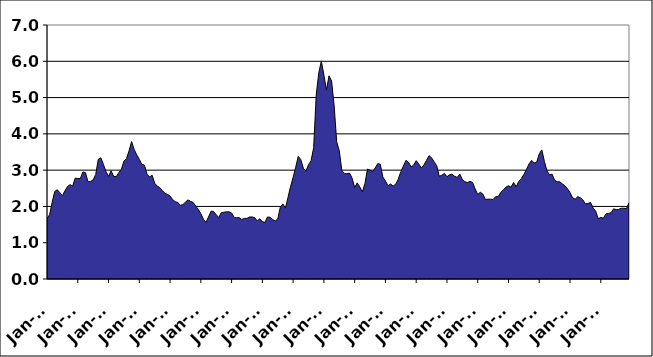
| Category | Series 0 |
|---|---|
| 2000-01-01 | 1.67 |
| 2000-02-01 | 1.77 |
| 2000-03-01 | 2.11 |
| 2000-04-01 | 2.41 |
| 2000-05-01 | 2.46 |
| 2000-06-01 | 2.38 |
| 2000-07-01 | 2.3 |
| 2000-08-01 | 2.43 |
| 2000-09-01 | 2.55 |
| 2000-10-01 | 2.6 |
| 2000-11-01 | 2.56 |
| 2000-12-01 | 2.78 |
| 2001-01-01 | 2.77 |
| 2001-02-01 | 2.77 |
| 2001-03-01 | 2.95 |
| 2001-04-01 | 2.93 |
| 2001-05-01 | 2.68 |
| 2001-06-01 | 2.69 |
| 2001-07-01 | 2.73 |
| 2001-08-01 | 2.88 |
| 2001-09-01 | 3.3 |
| 2001-10-01 | 3.34 |
| 2001-11-01 | 3.16 |
| 2001-12-01 | 2.96 |
| 2002-01-01 | 2.83 |
| 2002-02-01 | 2.98 |
| 2002-03-01 | 2.83 |
| 2002-04-01 | 2.82 |
| 2002-05-01 | 2.93 |
| 2002-06-01 | 3.02 |
| 2002-07-01 | 3.25 |
| 2002-08-01 | 3.32 |
| 2002-09-01 | 3.53 |
| 2002-10-01 | 3.79 |
| 2002-11-01 | 3.57 |
| 2002-12-01 | 3.42 |
| 2003-01-01 | 3.3 |
| 2003-02-01 | 3.16 |
| 2003-03-01 | 3.14 |
| 2003-04-01 | 2.89 |
| 2003-05-01 | 2.81 |
| 2003-06-01 | 2.86 |
| 2003-07-01 | 2.64 |
| 2003-08-01 | 2.56 |
| 2003-09-01 | 2.52 |
| 2003-10-01 | 2.44 |
| 2003-11-01 | 2.36 |
| 2003-12-01 | 2.33 |
| 2004-01-01 | 2.29 |
| 2004-02-01 | 2.19 |
| 2004-03-01 | 2.13 |
| 2004-04-01 | 2.11 |
| 2004-05-01 | 2.03 |
| 2004-06-01 | 2.05 |
| 2004-07-01 | 2.12 |
| 2004-08-01 | 2.18 |
| 2004-09-01 | 2.14 |
| 2004-10-01 | 2.11 |
| 2004-11-01 | 2.01 |
| 2004-12-01 | 1.92 |
| 2005-01-01 | 1.8 |
| 2005-02-01 | 1.65 |
| 2005-03-01 | 1.56 |
| 2005-04-01 | 1.71 |
| 2005-05-01 | 1.87 |
| 2005-06-01 | 1.86 |
| 2005-07-01 | 1.77 |
| 2005-08-01 | 1.7 |
| 2005-09-01 | 1.83 |
| 2005-10-01 | 1.84 |
| 2005-11-01 | 1.85 |
| 2005-12-01 | 1.85 |
| 2006-01-01 | 1.82 |
| 2006-02-01 | 1.7 |
| 2006-03-01 | 1.69 |
| 2006-04-01 | 1.69 |
| 2006-05-01 | 1.64 |
| 2006-06-01 | 1.67 |
| 2006-07-01 | 1.67 |
| 2006-08-01 | 1.71 |
| 2006-09-01 | 1.71 |
| 2006-10-01 | 1.69 |
| 2006-11-01 | 1.6 |
| 2006-12-01 | 1.66 |
| 2007-01-01 | 1.58 |
| 2007-02-01 | 1.56 |
| 2007-03-01 | 1.71 |
| 2007-04-01 | 1.7 |
| 2007-05-01 | 1.64 |
| 2007-06-01 | 1.6 |
| 2007-07-01 | 1.65 |
| 2007-08-01 | 1.98 |
| 2007-09-01 | 2.07 |
| 2007-10-01 | 1.95 |
| 2007-11-01 | 2.25 |
| 2007-12-01 | 2.55 |
| 2008-01-01 | 2.8 |
| 2008-02-01 | 3.08 |
| 2008-03-01 | 3.38 |
| 2008-04-01 | 3.29 |
| 2008-05-01 | 3.05 |
| 2008-06-01 | 2.97 |
| 2008-07-01 | 3.15 |
| 2008-08-01 | 3.26 |
| 2008-09-01 | 3.62 |
| 2008-10-01 | 5.07 |
| 2008-11-01 | 5.68 |
| 2008-12-01 | 6.01 |
| 2009-01-01 | 5.62 |
| 2009-02-01 | 5.21 |
| 2009-03-01 | 5.6 |
| 2009-04-01 | 5.46 |
| 2009-05-01 | 4.77 |
| 2009-06-01 | 3.78 |
| 2009-07-01 | 3.53 |
| 2009-08-01 | 2.99 |
| 2009-09-01 | 2.91 |
| 2009-10-01 | 2.9 |
| 2009-11-01 | 2.92 |
| 2009-12-01 | 2.78 |
| 2010-01-01 | 2.52 |
| 2010-02-01 | 2.65 |
| 2010-03-01 | 2.54 |
| 2010-04-01 | 2.4 |
| 2010-05-01 | 2.63 |
| 2010-06-01 | 3.03 |
| 2010-07-01 | 3 |
| 2010-08-01 | 2.96 |
| 2010-09-01 | 3.06 |
| 2010-10-01 | 3.18 |
| 2010-11-01 | 3.16 |
| 2010-12-01 | 2.81 |
| 2011-01-01 | 2.7 |
| 2011-02-01 | 2.57 |
| 2011-03-01 | 2.62 |
| 2011-04-01 | 2.56 |
| 2011-05-01 | 2.61 |
| 2011-06-01 | 2.75 |
| 2011-07-01 | 2.96 |
| 2011-08-01 | 3.11 |
| 2011-09-01 | 3.27 |
| 2011-10-01 | 3.22 |
| 2011-11-01 | 3.09 |
| 2011-12-01 | 3.14 |
| 2012-01-01 | 3.26 |
| 2012-02-01 | 3.17 |
| 2012-03-01 | 3.06 |
| 2012-04-01 | 3.14 |
| 2012-05-01 | 3.27 |
| 2012-06-01 | 3.4 |
| 2012-07-01 | 3.34 |
| 2012-08-01 | 3.23 |
| 2012-09-01 | 3.12 |
| 2012-10-01 | 2.83 |
| 2012-11-01 | 2.86 |
| 2012-12-01 | 2.91 |
| 2013-01-01 | 2.82 |
| 2013-02-01 | 2.87 |
| 2013-03-01 | 2.89 |
| 2013-04-01 | 2.83 |
| 2013-05-01 | 2.8 |
| 2013-06-01 | 2.89 |
| 2013-07-01 | 2.74 |
| 2013-08-01 | 2.68 |
| 2013-09-01 | 2.66 |
| 2013-10-01 | 2.69 |
| 2013-11-01 | 2.66 |
| 2013-12-01 | 2.48 |
| 2014-01-01 | 2.33 |
| 2014-02-01 | 2.39 |
| 2014-03-01 | 2.34 |
| 2014-04-01 | 2.19 |
| 2014-05-01 | 2.2 |
| 2014-06-01 | 2.2 |
| 2014-07-01 | 2.19 |
| 2014-08-01 | 2.27 |
| 2014-09-01 | 2.27 |
| 2014-10-01 | 2.39 |
| 2014-11-01 | 2.46 |
| 2014-12-01 | 2.53 |
| 2015-01-01 | 2.57 |
| 2015-02-01 | 2.53 |
| 2015-03-01 | 2.66 |
| 2015-04-01 | 2.54 |
| 2015-05-01 | 2.69 |
| 2015-06-01 | 2.77 |
| 2015-07-01 | 2.88 |
| 2015-08-01 | 3.02 |
| 2015-09-01 | 3.17 |
| 2015-10-01 | 3.27 |
| 2015-11-01 | 3.2 |
| 2015-12-01 | 3.22 |
| 2016-01-01 | 3.45 |
| 2016-02-01 | 3.56 |
| 2016-03-01 | 3.24 |
| 2016-04-01 | 2.98 |
| 2016-05-01 | 2.87 |
| 2016-06-01 | 2.89 |
| 2016-07-01 | 2.72 |
| 2016-08-01 | 2.68 |
| 2016-09-01 | 2.68 |
| 2016-10-01 | 2.62 |
| 2016-11-01 | 2.57 |
| 2016-12-01 | 2.49 |
| 2017-01-01 | 2.38 |
| 2017-02-01 | 2.24 |
| 2017-03-01 | 2.2 |
| 2017-04-01 | 2.27 |
| 2017-05-01 | 2.24 |
| 2017-06-01 | 2.18 |
| 2017-07-01 | 2.07 |
| 2017-08-01 | 2.08 |
| 2017-09-01 | 2.11 |
| 2017-10-01 | 1.96 |
| 2017-11-01 | 1.87 |
| 2017-12-01 | 1.66 |
| 2018-01-01 | 1.7 |
| 2018-02-01 | 1.672 |
| 2018-03-01 | 1.794 |
| 2018-04-01 | 1.808 |
| 2018-05-01 | 1.828 |
| 2018-06-01 | 1.934 |
| 2018-07-01 | 1.912 |
| 2018-08-01 | 1.92 |
| 2018-09-01 | 1.95 |
| 2018-10-01 | 1.95 |
| 2018-11-01 | 1.94 |
| 2018-12-01 | 2.1 |